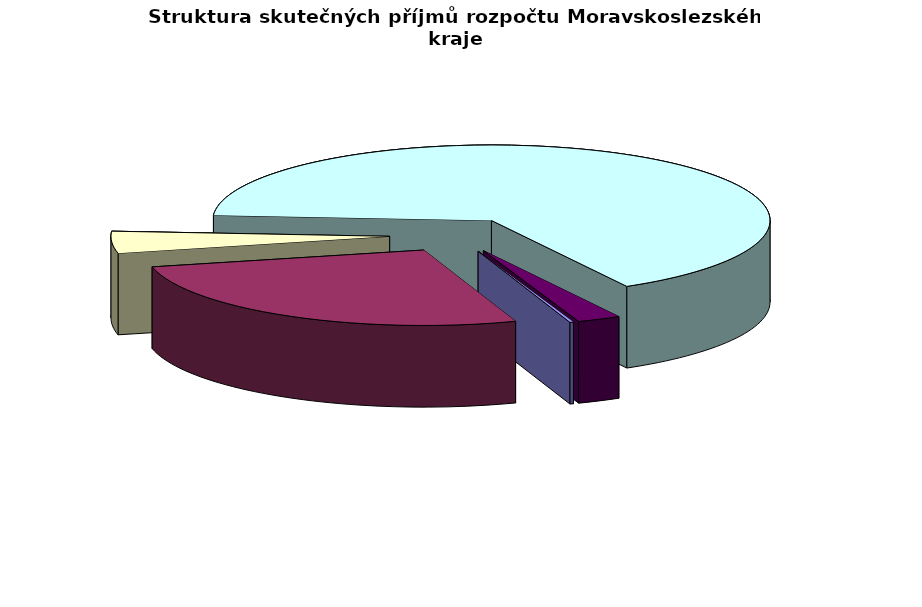
| Category | Čerpání v tis. Kč |
|---|---|
| Kapitálové příjmy | 57322.426 |
| Daňové příjmy | 7461806.966 |
| Investiční dotace | 1303231.231 |
| Neinvestiční dotace | 18353186.9 |
| Nedaňové příjmy | 703924.549 |